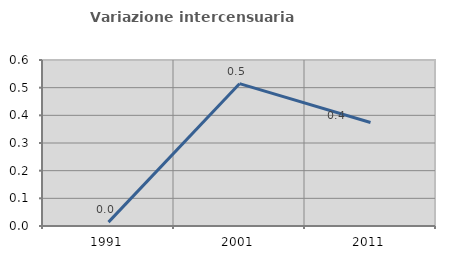
| Category | Variazione intercensuaria annua |
|---|---|
| 1991.0 | 0.014 |
| 2001.0 | 0.514 |
| 2011.0 | 0.374 |